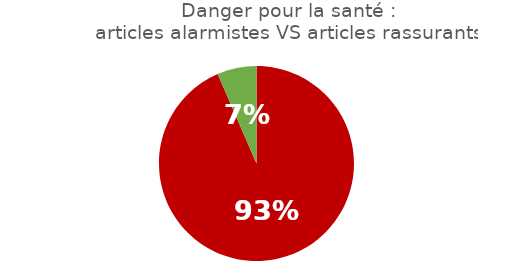
| Category | Series 0 |
|---|---|
| 0 | 43 |
| 1 | 3 |